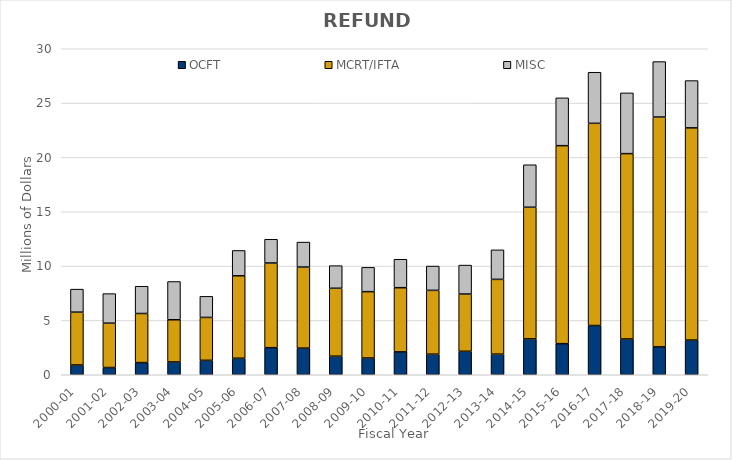
| Category | OCFT | MCRT/IFTA | MISC |
|---|---|---|---|
| 2000-01 | 0.9 | 4.862 | 2.117 |
| 2001-02 | 0.666 | 4.08 | 2.722 |
| 2002-03 | 1.12 | 4.517 | 2.509 |
| 2003-04 | 1.178 | 3.882 | 3.522 |
| 2004-05 | 1.329 | 3.947 | 1.939 |
| 2005-06 | 1.52 | 7.589 | 2.33 |
| 2006-07 | 2.493 | 7.792 | 2.182 |
| 2007-08 | 2.451 | 7.46 | 2.298 |
| 2008-09 | 1.709 | 6.251 | 2.082 |
| 2009-10 | 1.54 | 6.108 | 2.236 |
| 2010-11 | 2.106 | 5.904 | 2.619 |
| 2011-12 | 1.896 | 5.871 | 2.238 |
| 2012-13 | 2.16 | 5.269 | 2.663 |
| 2013-14 | 1.897 | 6.881 | 2.716 |
| 2014-15 | 3.301 | 12.113 | 3.91 |
| 2015-16 | 2.859 | 18.222 | 4.4 |
| 2016-17 | 4.532 | 18.607 | 4.701 |
| 2017-18 | 3.292 | 17.058 | 5.59 |
| 2018-19 | 2.565 | 21.15 | 5.105 |
| 2019-20 | 3.191 | 19.528 | 4.352 |